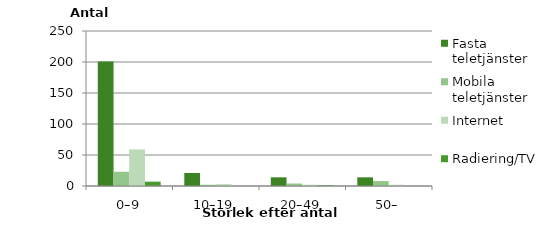
| Category | Fasta teletjänster | Mobila teletjänster | Internet | Radiering/TV |
|---|---|---|---|---|
| 0–9 | 201 | 23 | 59 | 7 |
| 10–19 | 21 | 2 | 3 | 0 |
| 20–49 | 14 | 4 | 2 | 1 |
| 50– | 14 | 8 | 2 | 0 |